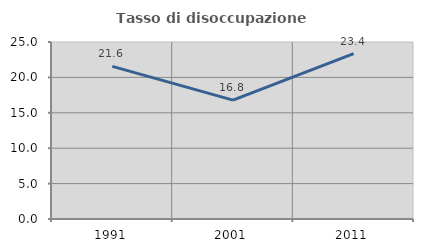
| Category | Tasso di disoccupazione giovanile  |
|---|---|
| 1991.0 | 21.559 |
| 2001.0 | 16.787 |
| 2011.0 | 23.353 |